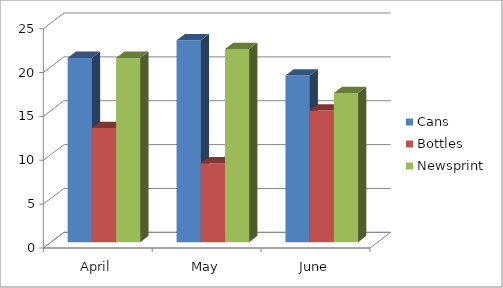
| Category | Cans | Bottles | Newsprint |
|---|---|---|---|
| April | 21 | 13 | 21 |
| May | 23 | 9 | 22 |
| June | 19 | 15 | 17 |